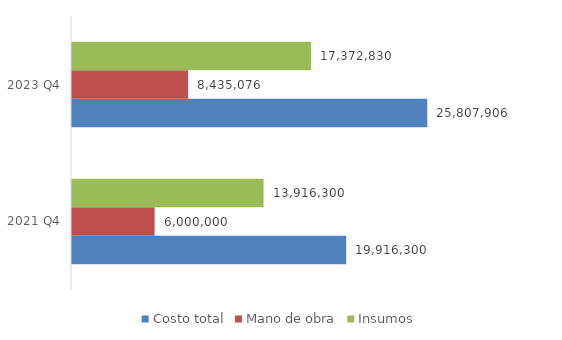
| Category | Costo total | Mano de obra | Insumos |
|---|---|---|---|
| 2021 Q4 | 19916300 | 6000000 | 13916300 |
| 2023 Q4 | 25807905.606 | 8435076 | 17372829.606 |